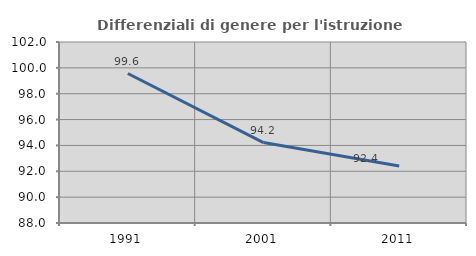
| Category | Differenziali di genere per l'istruzione superiore |
|---|---|
| 1991.0 | 99.562 |
| 2001.0 | 94.219 |
| 2011.0 | 92.412 |